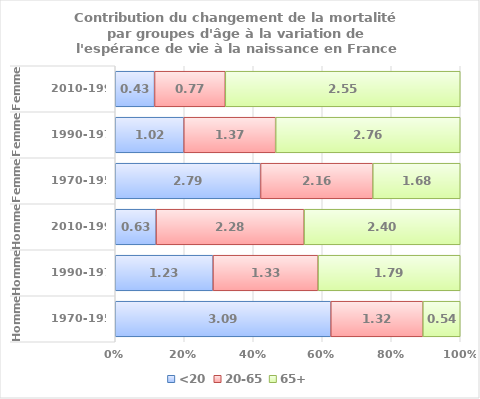
| Category | <20 | 20-65 | 65+ |
|---|---|---|---|
| 0 | 3.092 | 1.321 | 0.536 |
| 1 | 1.232 | 1.325 | 1.793 |
| 2 | 0.628 | 2.279 | 2.403 |
| 3 | 2.793 | 2.157 | 1.68 |
| 4 | 1.023 | 1.371 | 2.755 |
| 5 | 0.427 | 0.769 | 2.554 |